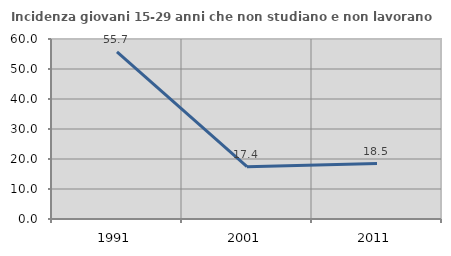
| Category | Incidenza giovani 15-29 anni che non studiano e non lavorano  |
|---|---|
| 1991.0 | 55.71 |
| 2001.0 | 17.431 |
| 2011.0 | 18.495 |